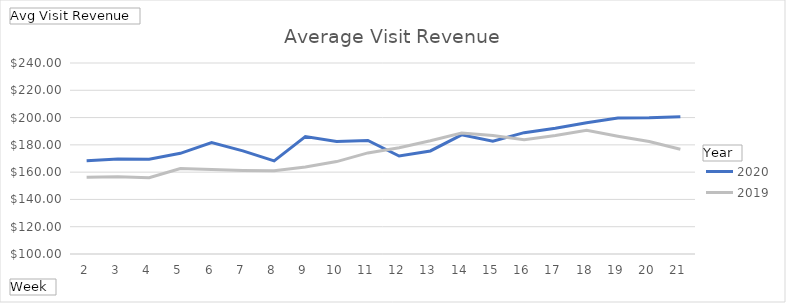
| Category | 2020 | 2019 |
|---|---|---|
| 2 | 168.414 | 156.334 |
| 3 | 169.612 | 156.667 |
| 4 | 169.43 | 155.965 |
| 5 | 173.801 | 162.674 |
| 6 | 181.661 | 161.967 |
| 7 | 175.579 | 161.269 |
| 8 | 168.261 | 160.962 |
| 9 | 186.034 | 163.831 |
| 10 | 182.456 | 167.746 |
| 11 | 183.235 | 174.101 |
| 12 | 171.82 | 177.86 |
| 13 | 175.529 | 182.967 |
| 14 | 187.356 | 188.623 |
| 15 | 182.669 | 186.794 |
| 16 | 188.927 | 183.769 |
| 17 | 192.173 | 186.818 |
| 18 | 196.242 | 190.682 |
| 19 | 199.693 | 186.332 |
| 20 | 199.833 | 182.448 |
| 21 | 200.654 | 176.804 |